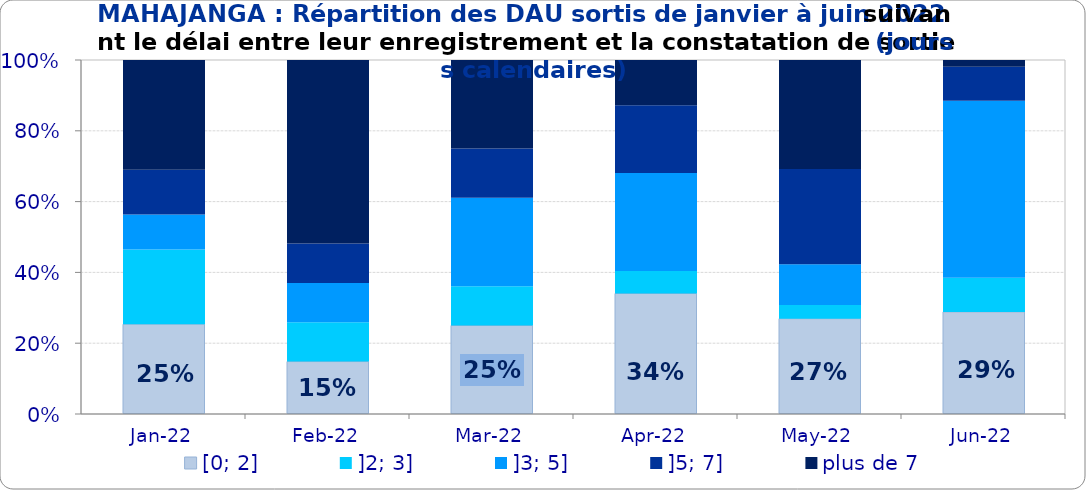
| Category | [0; 2] | ]2; 3] | ]3; 5] | ]5; 7] | plus de 7 |
|---|---|---|---|---|---|
| 2022-01-01 | 0.254 | 0.211 | 0.099 | 0.127 | 0.31 |
| 2022-02-01 | 0.148 | 0.111 | 0.111 | 0.111 | 0.519 |
| 2022-03-01 | 0.25 | 0.111 | 0.25 | 0.139 | 0.25 |
| 2022-04-01 | 0.34 | 0.064 | 0.277 | 0.191 | 0.128 |
| 2022-05-01 | 0.269 | 0.038 | 0.115 | 0.269 | 0.308 |
| 2022-06-01 | 0.288 | 0.096 | 0.5 | 0.096 | 0.019 |